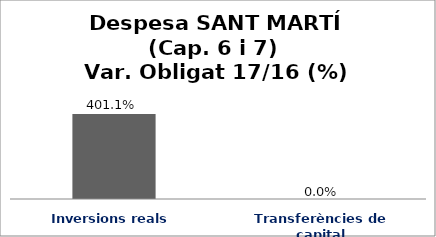
| Category | Series 0 |
|---|---|
| Inversions reals | 4.011 |
| Transferències de capital | 0 |